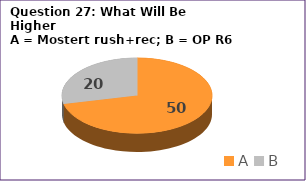
| Category | Series 0 |
|---|---|
| A | 50 |
| B | 20 |